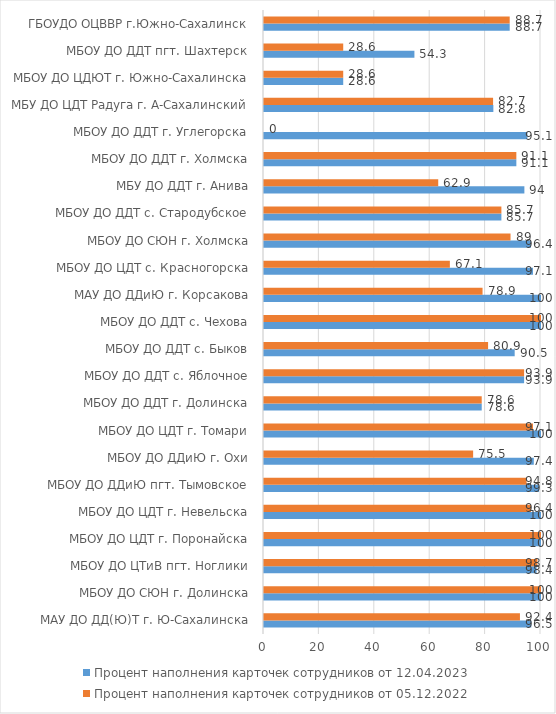
| Category | Процент наполнения карточек сотрудников от 12.04.2023 | Процент наполнения карточек сотрудников от 05.12.2022 |
|---|---|---|
| МАУ ДО ДД(Ю)Т г. Ю-Сахалинска | 96.5 | 92.4 |
| МБОУ ДО СЮН г. Долинска | 100 | 100 |
| МБОУ ДО ЦТиВ пгт. Ноглики | 98.4 | 98.7 |
| МБОУ ДО ЦДТ г. Поронайска | 100 | 100 |
| МБОУ ДО ЦДТ г. Невельска | 100 | 96.4 |
| МБОУ ДО ДДиЮ пгт. Тымовское | 99.3 | 94.8 |
| МБОУ ДО ДДиЮ г. Охи | 97.4 | 75.5 |
| МБОУ ДО ЦДТ г. Томари | 100 | 97.1 |
| МБОУ ДО ДДТ г. Долинска | 78.6 | 78.6 |
| МБОУ ДО ДДТ с. Яблочное | 93.9 | 93.9 |
| МБОУ ДО ДДТ с. Быков | 90.5 | 80.9 |
| МБОУ ДО ДДТ с. Чехова | 100 | 100 |
| МАУ ДО ДДиЮ г. Корсакова | 100 | 78.9 |
| МБОУ ДО ЦДТ с. Красногорска | 97.1 | 67.1 |
| МБОУ ДО СЮН г. Холмска | 96.4 | 89 |
| МБОУ ДО ДДТ с. Стародубское | 85.7 | 85.7 |
| МБУ ДО ДДТ г. Анива | 94 | 62.9 |
| МБОУ ДО ДДТ г. Холмска | 91.1 | 91.1 |
| МБОУ ДО ДДТ г. Углегорска | 95.1 | 0 |
| МБУ ДО ЦДТ Радуга г. А-Сахалинский | 82.8 | 82.7 |
| МБОУ ДО ЦДЮТ г. Южно-Сахалинска | 28.6 | 28.6 |
| МБОУ ДО ДДТ пгт. Шахтерск | 54.3 | 28.6 |
| ГБОУДО ОЦВВР г.Южно-Сахалинск | 88.7 | 88.7 |